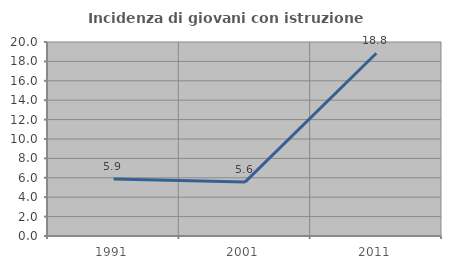
| Category | Incidenza di giovani con istruzione universitaria |
|---|---|
| 1991.0 | 5.882 |
| 2001.0 | 5.556 |
| 2011.0 | 18.841 |